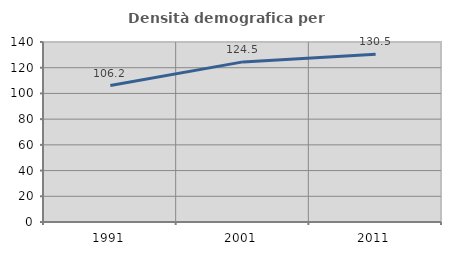
| Category | Densità demografica |
|---|---|
| 1991.0 | 106.154 |
| 2001.0 | 124.538 |
| 2011.0 | 130.468 |